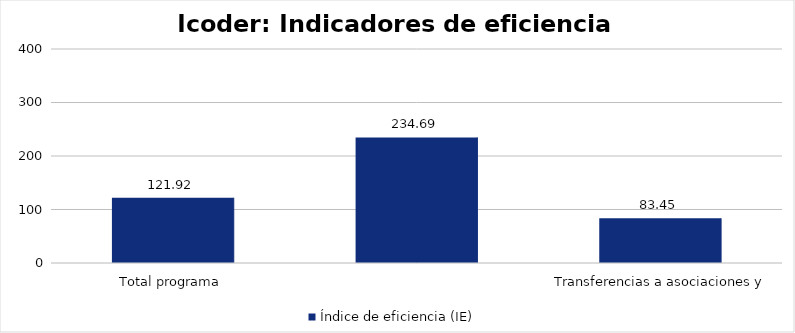
| Category | Índice de eficiencia (IE)  |
|---|---|
| Total programa | 121.92 |
| Transferencias a asociaciones y federaciones deportivas | 234.688 |
| Servicio de uso de parques e instalaciones deportivas | 83.453 |